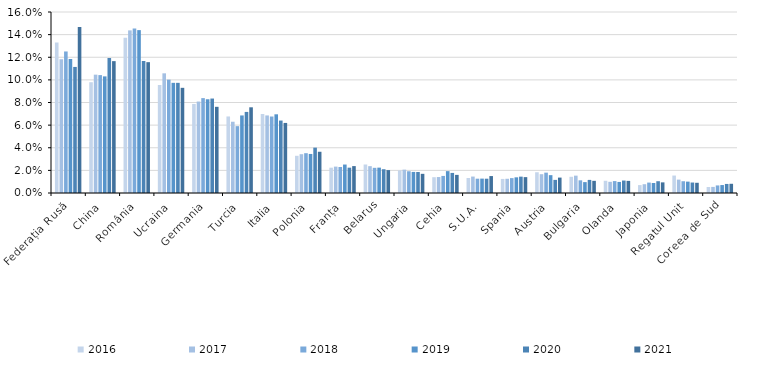
| Category | 2016 | 2017 | 2018 | 2019 | 2020 | 2021 |
|---|---|---|---|---|---|---|
| Federația Rusă | 13.312 | 11.833 | 12.511 | 11.853 | 11.143 | 14.681 |
| China | 9.792 | 10.46 | 10.421 | 10.309 | 11.925 | 11.656 |
| România | 13.718 | 14.375 | 14.552 | 14.398 | 11.668 | 11.565 |
| Ucraina | 9.549 | 10.579 | 10.019 | 9.738 | 9.738 | 9.297 |
| Germania | 7.871 | 8.085 | 8.387 | 8.286 | 8.349 | 7.618 |
| Turcia | 6.765 | 6.299 | 5.91 | 6.856 | 7.167 | 7.576 |
| Italia | 6.984 | 6.857 | 6.762 | 6.956 | 6.404 | 6.193 |
| Polonia | 3.288 | 3.43 | 3.519 | 3.451 | 4.01 | 3.645 |
| Franța | 2.238 | 2.332 | 2.298 | 2.516 | 2.24 | 2.378 |
| Belarus | 2.519 | 2.372 | 2.225 | 2.242 | 2.101 | 2.024 |
| Ungaria | 1.992 | 2.062 | 1.922 | 1.864 | 1.855 | 1.694 |
| Cehia | 1.397 | 1.412 | 1.51 | 1.933 | 1.774 | 1.602 |
| S.U.A. | 1.326 | 1.453 | 1.265 | 1.272 | 1.264 | 1.497 |
| Spania | 1.243 | 1.257 | 1.317 | 1.386 | 1.445 | 1.403 |
| Austria | 1.834 | 1.662 | 1.799 | 1.577 | 1.158 | 1.362 |
| Bulgaria | 1.433 | 1.534 | 1.121 | 0.962 | 1.158 | 1.076 |
| Olanda | 1.08 | 0.988 | 1.053 | 0.978 | 1.102 | 1.07 |
| Japonia | 0.7 | 0.777 | 0.921 | 0.884 | 1.042 | 0.94 |
| Regatul Unit  | 1.542 | 1.182 | 1.041 | 1.005 | 0.926 | 0.903 |
| Coreea de Sud | 0.533 | 0.539 | 0.668 | 0.703 | 0.801 | 0.814 |